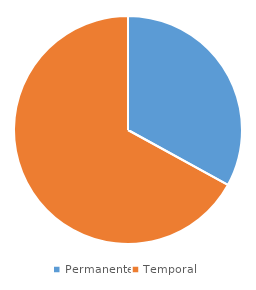
| Category | Series 0 |
|---|---|
| Permanente | 33 |
| Temporal  | 67 |